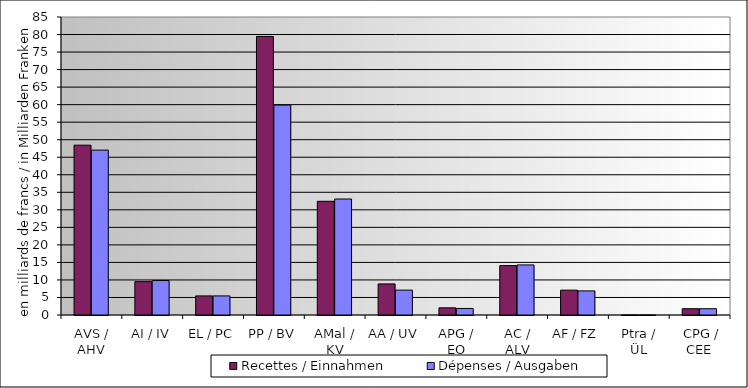
| Category | Recettes / Einnahmen | Dépenses / Ausgaben |
|---|---|---|
| AVS / AHV | 48.444 | 47.027 |
| AI / IV | 9.513 | 9.832 |
| EL / PC | 5.443 | 5.443 |
| PP / BV | 79.459 | 59.884 |
| AMal / KV | 32.44 | 33.086 |
| AA / UV | 8.865 | 7.091 |
| APG / EO | 2.049 | 1.865 |
| AC / ALV | 14.101 | 14.287 |
| AF / FZ | 7.087 | 6.874 |
| Ptra / ÜL | 0.002 | 0.002 |
|  CPG / CEE | 1.791 | 1.791 |